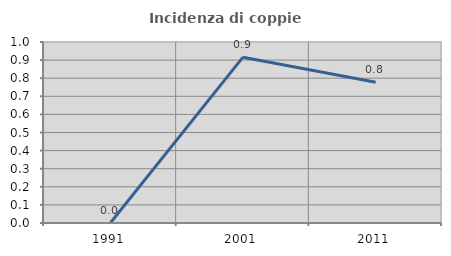
| Category | Incidenza di coppie miste |
|---|---|
| 1991.0 | 0 |
| 2001.0 | 0.916 |
| 2011.0 | 0.777 |